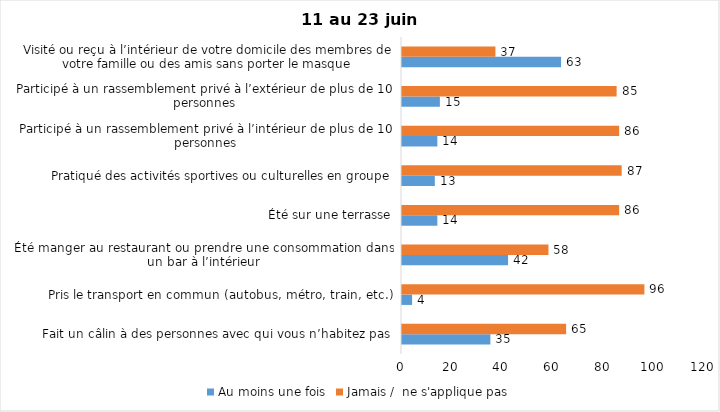
| Category | Au moins une fois | Jamais /  ne s'applique pas |
|---|---|---|
| Fait un câlin à des personnes avec qui vous n’habitez pas | 35 | 65 |
| Pris le transport en commun (autobus, métro, train, etc.) | 4 | 96 |
| Été manger au restaurant ou prendre une consommation dans un bar à l’intérieur | 42 | 58 |
| Été sur une terrasse | 14 | 86 |
| Pratiqué des activités sportives ou culturelles en groupe | 13 | 87 |
| Participé à un rassemblement privé à l’intérieur de plus de 10 personnes | 14 | 86 |
| Participé à un rassemblement privé à l’extérieur de plus de 10 personnes | 15 | 85 |
| Visité ou reçu à l’intérieur de votre domicile des membres de votre famille ou des amis sans porter le masque | 63 | 37 |